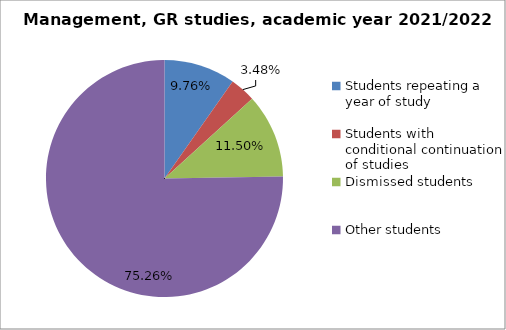
| Category | Series 0 |
|---|---|
| Students repeating a year of study | 28 |
| Students with conditional continuation of studies | 10 |
| Dismissed students | 33 |
| Other students | 216 |